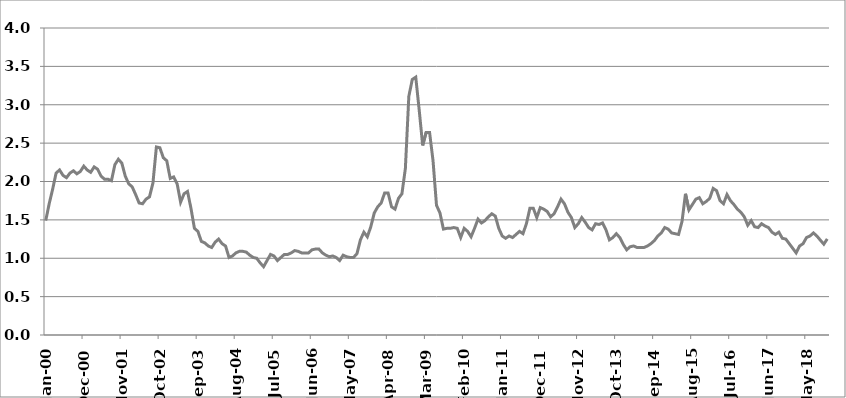
| Category | Series 1 |
|---|---|
| 2000-01-01 | 1.49 |
| 2000-02-01 | 1.71 |
| 2000-03-01 | 1.9 |
| 2000-04-01 | 2.11 |
| 2000-05-01 | 2.15 |
| 2000-06-01 | 2.08 |
| 2000-07-01 | 2.05 |
| 2000-08-01 | 2.11 |
| 2000-09-01 | 2.14 |
| 2000-10-01 | 2.1 |
| 2000-11-01 | 2.13 |
| 2000-12-01 | 2.2 |
| 2001-01-01 | 2.15 |
| 2001-02-01 | 2.12 |
| 2001-03-01 | 2.19 |
| 2001-04-01 | 2.16 |
| 2001-05-01 | 2.07 |
| 2001-06-01 | 2.03 |
| 2001-07-01 | 2.03 |
| 2001-08-01 | 2.01 |
| 2001-09-01 | 2.22 |
| 2001-10-01 | 2.29 |
| 2001-11-01 | 2.24 |
| 2001-12-01 | 2.07 |
| 2002-01-01 | 1.97 |
| 2002-02-01 | 1.93 |
| 2002-03-01 | 1.83 |
| 2002-04-01 | 1.72 |
| 2002-05-01 | 1.71 |
| 2002-06-01 | 1.77 |
| 2002-07-01 | 1.8 |
| 2002-08-01 | 1.98 |
| 2002-09-01 | 2.45 |
| 2002-10-01 | 2.44 |
| 2002-11-01 | 2.31 |
| 2002-12-01 | 2.27 |
| 2003-01-01 | 2.04 |
| 2003-02-01 | 2.06 |
| 2003-03-01 | 1.97 |
| 2003-04-01 | 1.73 |
| 2003-05-01 | 1.84 |
| 2003-06-01 | 1.87 |
| 2003-07-01 | 1.65 |
| 2003-08-01 | 1.39 |
| 2003-09-01 | 1.35 |
| 2003-10-01 | 1.22 |
| 2003-11-01 | 1.2 |
| 2003-12-01 | 1.16 |
| 2004-01-01 | 1.14 |
| 2004-02-01 | 1.21 |
| 2004-03-01 | 1.25 |
| 2004-04-01 | 1.19 |
| 2004-05-01 | 1.16 |
| 2004-06-01 | 1.01 |
| 2004-07-01 | 1.03 |
| 2004-08-01 | 1.07 |
| 2004-09-01 | 1.09 |
| 2004-10-01 | 1.09 |
| 2004-11-01 | 1.08 |
| 2004-12-01 | 1.04 |
| 2005-01-01 | 1.01 |
| 2005-02-01 | 1 |
| 2005-03-01 | 0.94 |
| 2005-04-01 | 0.89 |
| 2005-05-01 | 0.97 |
| 2005-06-01 | 1.05 |
| 2005-07-01 | 1.03 |
| 2005-08-01 | 0.97 |
| 2005-09-01 | 1.01 |
| 2005-10-01 | 1.05 |
| 2005-11-01 | 1.05 |
| 2005-12-01 | 1.07 |
| 2006-01-01 | 1.1 |
| 2006-02-01 | 1.09 |
| 2006-03-01 | 1.07 |
| 2006-04-01 | 1.07 |
| 2006-05-01 | 1.07 |
| 2006-06-01 | 1.11 |
| 2006-07-01 | 1.12 |
| 2006-08-01 | 1.12 |
| 2006-09-01 | 1.07 |
| 2006-10-01 | 1.04 |
| 2006-11-01 | 1.02 |
| 2006-12-01 | 1.03 |
| 2007-01-01 | 1.01 |
| 2007-02-01 | 0.97 |
| 2007-03-01 | 1.04 |
| 2007-04-01 | 1.02 |
| 2007-05-01 | 1.01 |
| 2007-06-01 | 1.01 |
| 2007-07-01 | 1.06 |
| 2007-08-01 | 1.24 |
| 2007-09-01 | 1.34 |
| 2007-10-01 | 1.28 |
| 2007-11-01 | 1.41 |
| 2007-12-01 | 1.59 |
| 2008-01-01 | 1.67 |
| 2008-02-01 | 1.72 |
| 2008-03-01 | 1.85 |
| 2008-04-01 | 1.85 |
| 2008-05-01 | 1.67 |
| 2008-06-01 | 1.64 |
| 2008-07-01 | 1.78 |
| 2008-08-01 | 1.84 |
| 2008-09-01 | 2.17 |
| 2008-10-01 | 3.11 |
| 2008-11-01 | 3.33 |
| 2008-12-01 | 3.36 |
| 2009-01-01 | 2.93 |
| 2009-02-01 | 2.47 |
| 2009-03-01 | 2.64 |
| 2009-04-01 | 2.64 |
| 2009-05-01 | 2.27 |
| 2009-06-01 | 1.69 |
| 2009-07-01 | 1.59 |
| 2009-08-01 | 1.38 |
| 2009-09-01 | 1.39 |
| 2009-10-01 | 1.39 |
| 2009-11-01 | 1.4 |
| 2009-12-01 | 1.39 |
| 2010-01-01 | 1.27 |
| 2010-02-01 | 1.39 |
| 2010-03-01 | 1.35 |
| 2010-04-01 | 1.28 |
| 2010-05-01 | 1.39 |
| 2010-06-01 | 1.51 |
| 2010-07-01 | 1.46 |
| 2010-08-01 | 1.49 |
| 2010-09-01 | 1.54 |
| 2010-10-01 | 1.58 |
| 2010-11-01 | 1.55 |
| 2010-12-01 | 1.39 |
| 2011-01-01 | 1.29 |
| 2011-02-01 | 1.26 |
| 2011-03-01 | 1.29 |
| 2011-04-01 | 1.27 |
| 2011-05-01 | 1.31 |
| 2011-06-01 | 1.35 |
| 2011-07-01 | 1.32 |
| 2011-08-01 | 1.45 |
| 2011-09-01 | 1.65 |
| 2011-10-01 | 1.65 |
| 2011-11-01 | 1.53 |
| 2011-12-01 | 1.66 |
| 2012-01-01 | 1.64 |
| 2012-02-01 | 1.61 |
| 2012-03-01 | 1.54 |
| 2012-04-01 | 1.58 |
| 2012-05-01 | 1.67 |
| 2012-06-01 | 1.77 |
| 2012-07-01 | 1.71 |
| 2012-08-01 | 1.6 |
| 2012-09-01 | 1.53 |
| 2012-10-01 | 1.4 |
| 2012-11-01 | 1.45 |
| 2012-12-01 | 1.53 |
| 2013-01-01 | 1.47 |
| 2013-02-01 | 1.4 |
| 2013-03-01 | 1.37 |
| 2013-04-01 | 1.45 |
| 2013-05-01 | 1.44 |
| 2013-06-01 | 1.46 |
| 2013-07-01 | 1.37 |
| 2013-08-01 | 1.24 |
| 2013-09-01 | 1.27 |
| 2013-10-01 | 1.32 |
| 2013-11-01 | 1.27 |
| 2013-12-01 | 1.18 |
| 2014-01-01 | 1.11 |
| 2014-02-01 | 1.15 |
| 2014-03-01 | 1.16 |
| 2014-04-01 | 1.14 |
| 2014-05-01 | 1.14 |
| 2014-06-01 | 1.14 |
| 2014-07-01 | 1.16 |
| 2014-08-01 | 1.19 |
| 2014-09-01 | 1.23 |
| 2014-10-01 | 1.29 |
| 2014-11-01 | 1.33 |
| 2014-12-01 | 1.4 |
| 2015-01-01 | 1.38 |
| 2015-02-01 | 1.33 |
| 2015-03-01 | 1.32 |
| 2015-04-01 | 1.31 |
| 2015-05-01 | 1.48 |
| 2015-06-01 | 1.84 |
| 2015-07-01 | 1.63 |
| 2015-08-01 | 1.7 |
| 2015-09-01 | 1.77 |
| 2015-10-01 | 1.79 |
| 2015-11-01 | 1.71 |
| 2015-12-01 | 1.74 |
| 2016-01-01 | 1.78 |
| 2016-02-01 | 1.91 |
| 2016-03-01 | 1.88 |
| 2016-04-01 | 1.75 |
| 2016-05-01 | 1.71 |
| 2016-06-01 | 1.83 |
| 2016-07-01 | 1.75 |
| 2016-08-01 | 1.7 |
| 2016-09-01 | 1.64 |
| 2016-10-01 | 1.6 |
| 2016-11-01 | 1.54 |
| 2016-12-01 | 1.43 |
| 2017-01-01 | 1.49 |
| 2017-02-01 | 1.41 |
| 2017-03-01 | 1.4 |
| 2017-04-01 | 1.45 |
| 2017-05-01 | 1.42 |
| 2017-06-01 | 1.4 |
| 2017-07-01 | 1.34 |
| 2017-08-01 | 1.31 |
| 2017-09-01 | 1.34 |
| 2017-10-01 | 1.26 |
| 2017-11-01 | 1.25 |
| 2017-12-01 | 1.19 |
| 2018-01-01 | 1.13 |
| 2018-02-01 | 1.07 |
| 2018-03-01 | 1.16 |
| 2018-04-01 | 1.19 |
| 2018-05-01 | 1.27 |
| 2018-06-01 | 1.29 |
| 2018-07-01 | 1.33 |
| 2018-08-01 | 1.29 |
| 2018-09-01 | 1.235 |
| 2018-10-01 | 1.184 |
| 2018-11-01 | 1.252 |